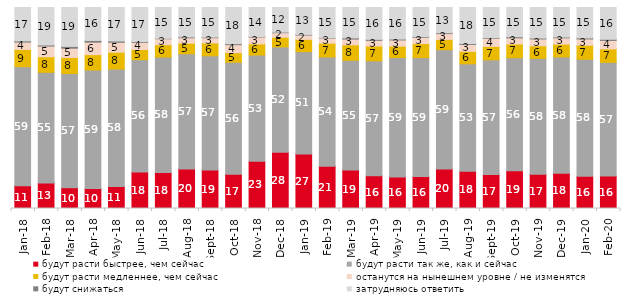
| Category | будут расти быстрее, чем сейчас | будут расти так же, как и сейчас | будут расти медленнее, чем сейчас | останутся на нынешнем уровне / не изменятся | будут снижаться | затрудняюсь ответить |
|---|---|---|---|---|---|---|
| 2018-01-01 | 11.35 | 59.2 | 8.6 | 3.65 | 0.6 | 16.6 |
| 2018-02-01 | 12.7 | 55.05 | 7.75 | 5.3 | 0.55 | 18.65 |
| 2018-03-01 | 10.3 | 56.85 | 8 | 4.6 | 0.9 | 19.35 |
| 2018-04-01 | 9.9 | 59 | 7.65 | 6.2 | 0.85 | 16.4 |
| 2018-05-01 | 10.95 | 58.4 | 8.4 | 4.95 | 0.65 | 16.65 |
| 2018-06-01 | 18.15 | 55.9 | 5.05 | 3.6 | 0.4 | 16.9 |
| 2018-07-01 | 17.85 | 57.5 | 6.15 | 2.95 | 0.2 | 15.35 |
| 2018-08-01 | 19.65 | 57.35 | 5.25 | 2.7 | 0.4 | 14.65 |
| 2018-09-01 | 19.1 | 56.85 | 6.4 | 2.6 | 0.3 | 14.75 |
| 2018-10-01 | 17.1 | 55.65 | 4.8 | 3.95 | 0.5 | 18 |
| 2018-11-01 | 23.453 | 52.894 | 5.539 | 3.443 | 0.2 | 14.471 |
| 2018-12-01 | 27.95 | 52.45 | 4.8 | 2.25 | 0.3 | 12.25 |
| 2019-01-01 | 27.15 | 50.9 | 6.1 | 2.15 | 0.3 | 13.4 |
| 2019-02-01 | 21.05 | 54.35 | 6.85 | 2.55 | 0.2 | 15 |
| 2019-03-01 | 19.095 | 54.649 | 7.708 | 2.834 | 0.597 | 15.117 |
| 2019-04-01 | 16.287 | 57.178 | 7.376 | 2.822 | 0.495 | 15.842 |
| 2019-05-01 | 15.701 | 59.435 | 5.646 | 3.071 | 0.446 | 15.701 |
| 2019-06-01 | 15.86 | 59.202 | 6.983 | 3.092 | 0.349 | 14.514 |
| 2019-07-01 | 19.604 | 59.406 | 5.099 | 2.921 | 0.396 | 12.574 |
| 2019-08-01 | 18.482 | 53.497 | 6.194 | 3.447 | 0.45 | 17.932 |
| 2019-09-01 | 16.881 | 57.079 | 6.683 | 4.01 | 0.297 | 15.05 |
| 2019-10-01 | 18.762 | 56.238 | 6.832 | 3.069 | 0.545 | 14.554 |
| 2019-11-01 | 17.03 | 57.673 | 6.238 | 3.416 | 0.446 | 15.198 |
| 2019-12-01 | 17.574 | 57.822 | 6.386 | 3.119 | 0.396 | 14.703 |
| 2020-01-01 | 15.99 | 58.267 | 6.98 | 3.119 | 0.495 | 15.149 |
| 2020-02-01 | 16.139 | 56.584 | 6.683 | 4.208 | 0.594 | 15.792 |